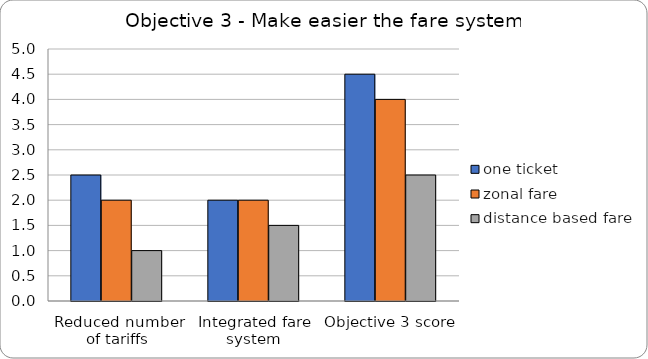
| Category | one ticket | zonal fare | distance based fare |
|---|---|---|---|
| Reduced number of tariffs | 2.5 | 2 | 1 |
| Integrated fare system | 2 | 2 | 1.5 |
| Objective 3 score | 4.5 | 4 | 2.5 |